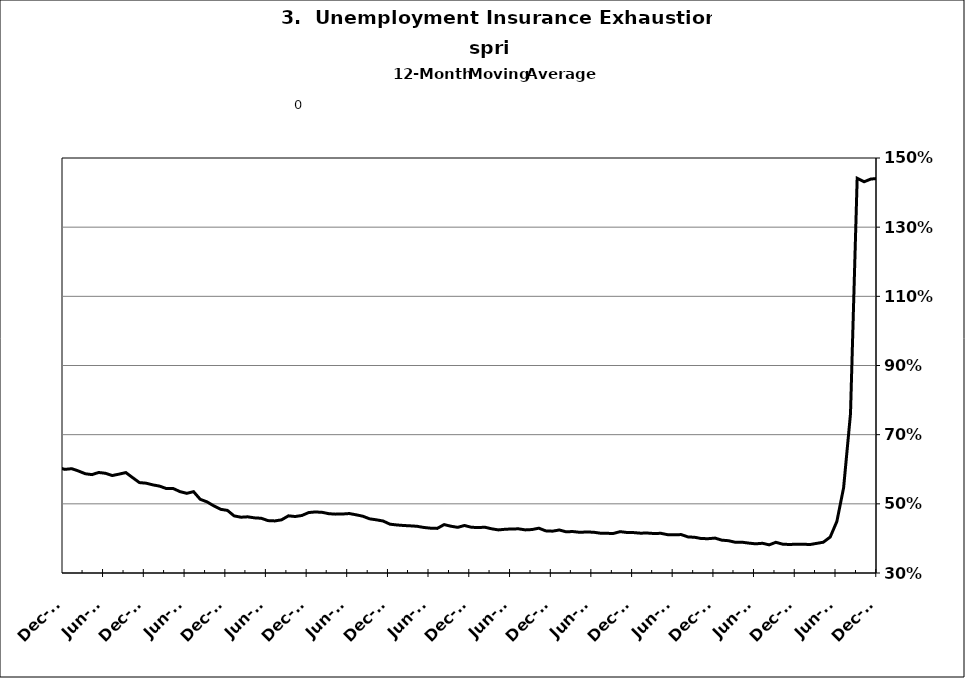
| Category | Series 0 |
|---|---|
| 2002-12-31 | 0.428 |
| 2003-01-31 | 0.432 |
| 2003-02-28 | 0.437 |
| 2003-03-31 | 0.445 |
| 2003-04-30 | 0.455 |
| 2003-05-31 | 0.466 |
| 2003-06-30 | 0.475 |
| 2003-07-31 | 0.485 |
| 2003-08-31 | 0.499 |
| 2003-09-30 | 0.502 |
| 2003-10-31 | 0.5 |
| 2003-11-30 | 0.506 |
| 2003-12-31 | 0.505 |
| 2004-01-31 | 0.505 |
| 2004-02-29 | 0.507 |
| 2004-03-31 | 0.501 |
| 2004-04-30 | 0.491 |
| 2004-05-31 | 0.486 |
| 2004-06-30 | 0.477 |
| 2004-07-31 | 0.466 |
| 2004-08-31 | 0.464 |
| 2004-09-30 | 0.452 |
| 2004-10-31 | 0.448 |
| 2004-11-30 | 0.44 |
| 2004-12-31 | 0.429 |
| 2005-01-31 | 0.429 |
| 2005-02-28 | 0.418 |
| 2005-03-31 | 0.412 |
| 2005-04-30 | 0.409 |
| 2005-05-31 | 0.404 |
| 2005-06-30 | 0.398 |
| 2005-07-31 | 0.4 |
| 2005-08-31 | 0.398 |
| 2005-09-30 | 0.398 |
| 2005-10-31 | 0.398 |
| 2005-11-30 | 0.392 |
| 2005-12-31 | 0.391 |
| 2006-01-31 | 0.388 |
| 2006-02-28 | 0.385 |
| 2006-03-31 | 0.381 |
| 2006-04-30 | 0.383 |
| 2006-05-31 | 0.387 |
| 2006-06-30 | 0.387 |
| 2006-07-31 | 0.393 |
| 2006-08-31 | 0.401 |
| 2006-09-30 | 0.415 |
| 2006-10-31 | 0.422 |
| 2006-11-30 | 0.423 |
| 2006-12-31 | 0.427 |
| 2007-01-31 | 0.425 |
| 2007-02-28 | 0.427 |
| 2007-03-31 | 0.431 |
| 2007-04-30 | 0.437 |
| 2007-05-31 | 0.434 |
| 2007-06-30 | 0.436 |
| 2007-07-30 | 0.443 |
| 2007-08-31 | 0.435 |
| 2007-09-30 | 0.437 |
| 2007-10-31 | 0.433 |
| 2007-11-15 | 0.438 |
| 2007-12-15 09:36:00 | 0.446 |
| 2008-01-14 19:12:00 | 0.447 |
| 2008-02-14 04:48:00 | 0.455 |
| 2008-03-15 14:24:00 | 0.462 |
| 2008-04-15 | 0.462 |
| 2008-05-15 09:36:00 | 0.467 |
| 2008-06-14 19:12:00 | 0.475 |
| 2008-07-15 04:48:00 | 0.47 |
| 2008-08-14 14:24:00 | 0.469 |
| 2008-09-14 | 0.473 |
| 2008-10-14 09:36:00 | 0.478 |
| 2008-11-13 19:12:00 | 0.489 |
| 2008-12-14 04:48:00 | 0.497 |
| 2009-01-13 14:24:00 | 0.51 |
| 2009-02-13 | 0.528 |
| 2009-03-15 09:36:00 | 0.547 |
| 2009-04-14 19:12:00 | 0.565 |
| 2009-05-15 04:48:00 | 0.582 |
| 2009-06-14 14:24:00 | 0.6 |
| 2009-07-15 | 0.611 |
| 2009-08-14 09:36:00 | 0.631 |
| 2009-09-13 19:12:00 | 0.623 |
| 2009-10-14 04:48:00 | 0.631 |
| 2009-11-13 14:24:00 | 0.65 |
| 2009-12-14 | 0.65 |
| 2010-01-13 09:36:00 | 0.657 |
| 2010-02-12 19:12:00 | 0.652 |
| 2010-03-15 04:48:00 | 0.649 |
| 2010-04-14 14:24:00 | 0.636 |
| 2010-05-15 | 0.623 |
| 2010-06-14 09:36:00 | 0.615 |
| 2010-07-14 19:12:00 | 0.604 |
| 2010-08-14 04:48:00 | 0.596 |
| 2010-09-13 14:24:00 | 0.591 |
| 2010-10-14 | 0.608 |
| 2010-11-13 09:36:00 | 0.605 |
| 2010-12-13 19:12:00 | 0.6 |
| 2011-01-13 04:48:00 | 0.602 |
| 2011-02-12 14:24:00 | 0.595 |
| 2011-03-15 | 0.587 |
| 2011-04-14 09:36:00 | 0.584 |
| 2011-05-14 19:12:00 | 0.591 |
| 2011-06-14 04:48:00 | 0.588 |
| 2011-07-14 14:24:00 | 0.582 |
| 2011-08-14 | 0.586 |
| 2011-09-13 09:36:00 | 0.59 |
| 2011-10-13 19:12:00 | 0.576 |
| 2011-11-13 04:48:00 | 0.561 |
| 2011-12-13 14:24:00 | 0.56 |
| 2012-01-13 | 0.555 |
| 2012-02-12 09:36:00 | 0.551 |
| 2012-03-13 19:12:00 | 0.544 |
| 2012-04-13 04:48:00 | 0.544 |
| 2012-05-13 14:24:00 | 0.535 |
| 2012-06-13 | 0.53 |
| 2012-07-13 09:36:00 | 0.535 |
| 2012-08-12 19:12:00 | 0.513 |
| 2012-09-12 04:48:00 | 0.506 |
| 2012-10-12 14:24:00 | 0.494 |
| 2012-11-12 | 0.484 |
| 2012-12-12 09:36:00 | 0.481 |
| 2013-01-11 19:12:00 | 0.465 |
| 2013-02-11 04:48:00 | 0.461 |
| 2013-03-13 14:24:00 | 0.462 |
| 2013-04-13 | 0.459 |
| 2013-05-13 09:36:00 | 0.458 |
| 2013-06-12 19:12:00 | 0.452 |
| 2013-07-13 04:48:00 | 0.451 |
| 2013-08-12 14:24:00 | 0.454 |
| 2013-09-12 | 0.465 |
| 2013-10-12 09:36:00 | 0.463 |
| 2013-11-11 19:12:00 | 0.466 |
| 2013-12-12 04:48:00 | 0.475 |
| 2014-01-11 14:24:00 | 0.477 |
| 2014-02-11 | 0.475 |
| 2014-03-13 09:36:00 | 0.471 |
| 2014-04-12 19:12:00 | 0.47 |
| 2014-05-13 04:48:00 | 0.471 |
| 2014-06-12 14:24:00 | 0.472 |
| 2014-07-13 | 0.468 |
| 2014-08-12 09:36:00 | 0.464 |
| 2014-09-11 19:12:00 | 0.457 |
| 2014-10-12 04:48:00 | 0.454 |
| 2014-11-11 14:24:00 | 0.45 |
| 2014-12-12 | 0.441 |
| 2015-01-11 09:36:00 | 0.439 |
| 2015-02-10 19:12:00 | 0.437 |
| 2015-03-13 04:48:00 | 0.436 |
| 2015-04-12 14:24:00 | 0.435 |
| 2015-05-13 | 0.432 |
| 2015-06-12 09:36:00 | 0.43 |
| 2015-07-12 19:12:00 | 0.429 |
| 2015-08-12 04:48:00 | 0.44 |
| 2015-09-11 14:24:00 | 0.435 |
| 2015-10-12 | 0.432 |
| 2015-11-11 09:36:00 | 0.437 |
| 2015-12-11 19:12:00 | 0.432 |
| 2016-01-11 04:48:00 | 0.431 |
| 2016-02-10 14:24:00 | 0.432 |
| 2016-03-12 | 0.428 |
| 2016-04-11 09:36:00 | 0.425 |
| 2016-05-11 19:12:00 | 0.426 |
| 2016-06-11 04:48:00 | 0.427 |
| 2016-07-11 14:24:00 | 0.428 |
| 2016-08-11 | 0.425 |
| 2016-09-10 09:36:00 | 0.426 |
| 2016-10-10 19:12:00 | 0.43 |
| 2016-11-10 04:48:00 | 0.422 |
| 2016-12-10 14:24:00 | 0.421 |
| 2017-01-10 | 0.424 |
| 2017-02-09 09:36:00 | 0.419 |
| 2017-03-11 19:12:00 | 0.42 |
| 2017-04-11 04:48:00 | 0.418 |
| 2017-05-11 14:24:00 | 0.418 |
| 2017-06-11 | 0.418 |
| 2017-07-11 09:36:00 | 0.415 |
| 2017-08-10 19:12:00 | 0.415 |
| 2017-09-10 04:48:00 | 0.414 |
| 2017-10-10 14:24:00 | 0.42 |
| 2017-11-10 | 0.417 |
| 2017-12-10 09:36:00 | 0.417 |
| 2018-01-09 19:12:00 | 0.415 |
| 2018-02-09 04:48:00 | 0.416 |
| 2018-03-11 14:24:00 | 0.414 |
| 2018-04-11 | 0.415 |
| 2018-05-11 09:36:00 | 0.411 |
| 2018-06-10 19:12:00 | 0.41 |
| 2018-07-11 04:48:00 | 0.411 |
| 2018-08-10 14:24:00 | 0.404 |
| 2018-09-10 | 0.403 |
| 2018-10-10 09:36:00 | 0.4 |
| 2018-11-09 19:12:00 | 0.399 |
| 2018-12-10 04:48:00 | 0.401 |
| 2019-01-09 14:24:00 | 0.395 |
| 2019-02-09 | 0.393 |
| 2019-03-11 09:36:00 | 0.389 |
| 2019-04-10 19:12:00 | 0.389 |
| 2019-05-11 04:48:00 | 0.386 |
| 2019-06-10 14:24:00 | 0.384 |
| 2019-07-11 | 0.386 |
| 2019-08-10 09:36:00 | 0.381 |
| 2019-09-09 19:12:00 | 0.389 |
| 2019-10-10 04:48:00 | 0.383 |
| 2019-11-09 14:24:00 | 0.382 |
| 2019-12-10 | 0.383 |
| 2020-01-09 09:36:00 | 0.383 |
| 2020-02-08 19:12:00 | 0.382 |
| 2020-03-10 04:48:00 | 0.386 |
| 2020-04-09 14:24:00 | 0.389 |
| 2020-05-10 | 0.404 |
| 2020-06-09 09:36:00 | 0.449 |
| 2020-07-09 19:12:00 | 0.546 |
| 2020-08-09 04:48:00 | 0.76 |
| 2020-09-08 14:24:00 | 1.441 |
| 2020-10-09 | 1.431 |
| 2020-11-08 09:36:00 | 1.439 |
| 2020-12-08 19:12:00 | 1.441 |